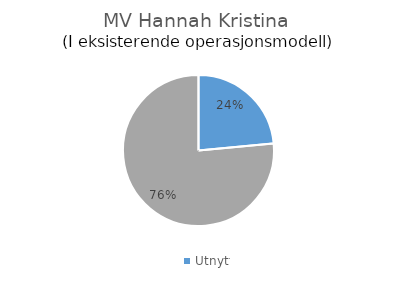
| Category | Series 0 |
|---|---|
| Utnyttet kapasitet | 0.235 |